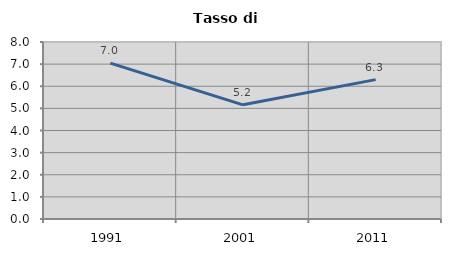
| Category | Tasso di disoccupazione   |
|---|---|
| 1991.0 | 7.042 |
| 2001.0 | 5.161 |
| 2011.0 | 6.3 |